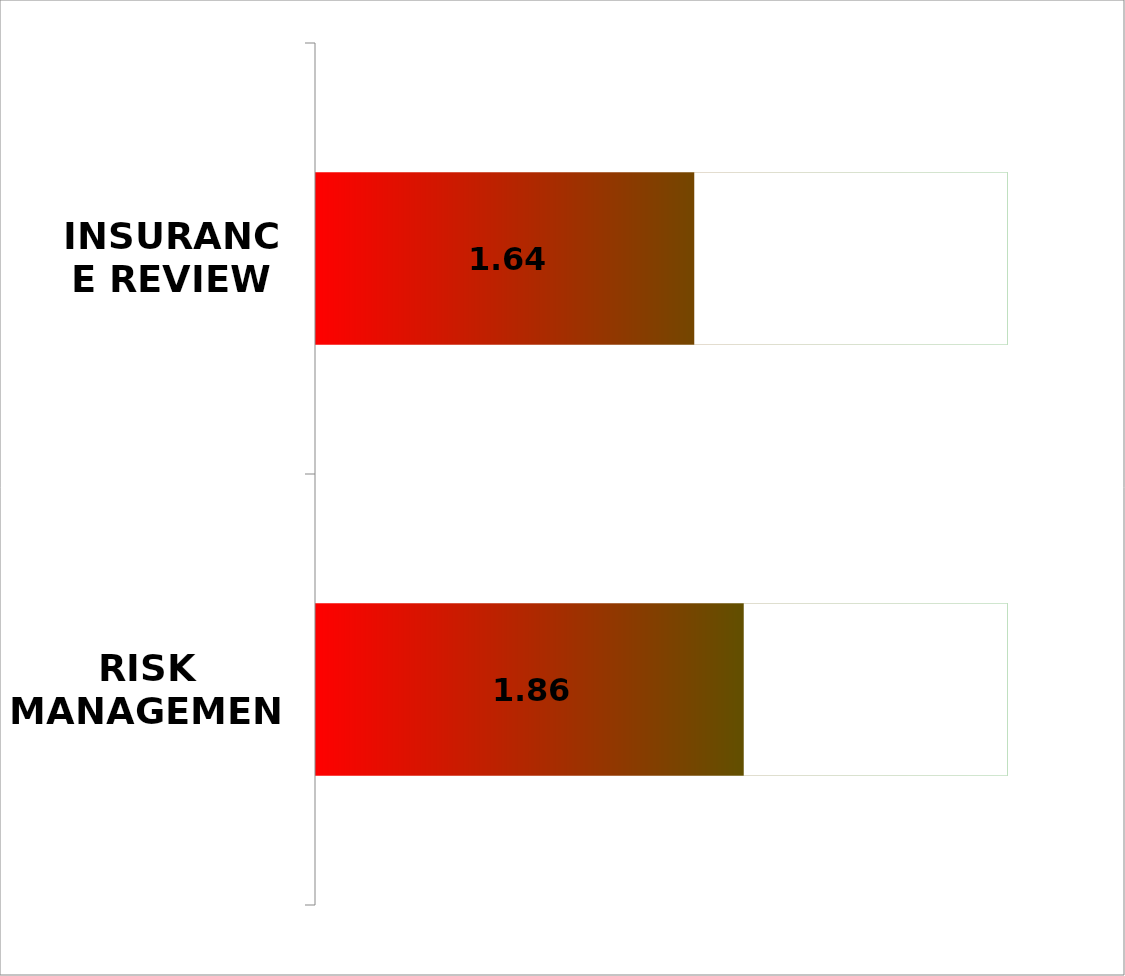
| Category | Series 2 |
|---|---|
| RISK MANAGEMENT | 3 |
| INSURANCE REVIEW | 3 |